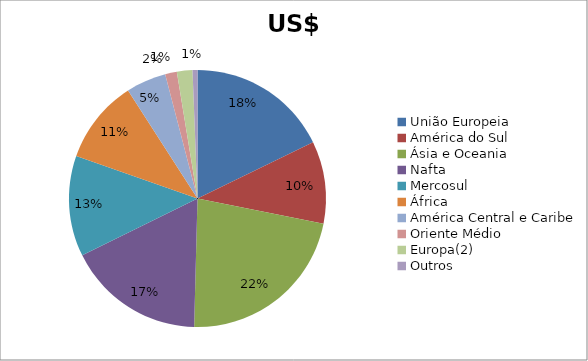
| Category | Series 0 |
|---|---|
| União Europeia | 3297043176 |
| América do Sul | 1919020899 |
| Ásia e Oceania | 4128691400 |
| Nafta | 3205231601 |
| Mercosul | 2348503140 |
| África | 1952615489 |
| América Central e Caribe | 934010514 |
| Oriente Médio | 273409375 |
| Europa(2) | 362472763 |
| Outros | 114458368 |